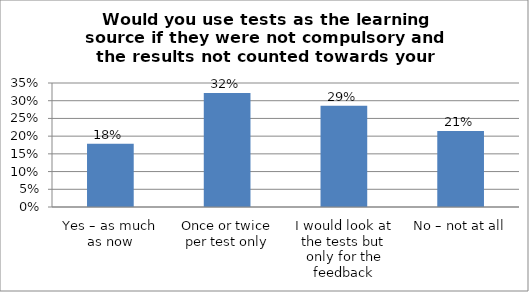
| Category | Series 0 |
|---|---|
| Yes – as much as now | 0.179 |
| Once or twice per test only | 0.321 |
| I would look at the tests but only for the feedback | 0.286 |
| No – not at all | 0.214 |